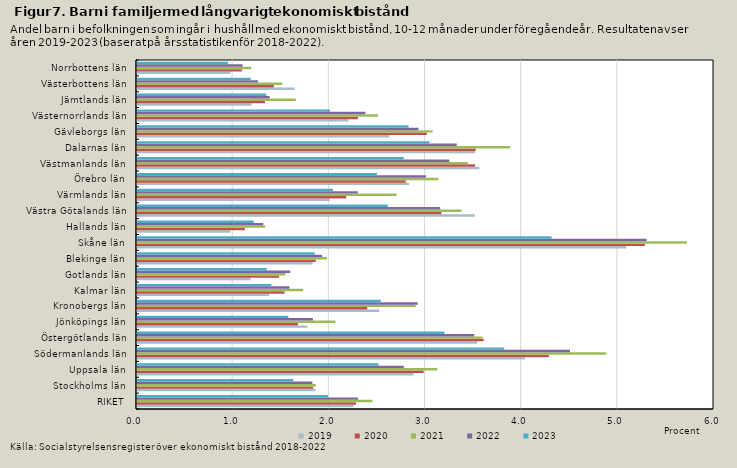
| Category | 2019 | 2020 | 2021 | 2022 | 2023 |
|---|---|---|---|---|---|
| RIKET | 2.251 | 2.277 | 2.449 | 2.298 | 1.986 |
| Stockholms län | 1.855 | 1.831 | 1.859 | 1.823 | 1.625 |
| Uppsala län | 2.876 | 2.981 | 3.123 | 2.774 | 2.512 |
| Södermanlands län | 4.034 | 4.282 | 4.881 | 4.503 | 3.818 |
| Östergötlands län | 3.537 | 3.605 | 3.592 | 3.507 | 3.197 |
| Jönköpings län | 1.773 | 1.672 | 2.063 | 1.83 | 1.573 |
| Kronobergs län | 2.52 | 2.394 | 2.897 | 2.919 | 2.536 |
| Kalmar län | 1.375 | 1.534 | 1.728 | 1.586 | 1.398 |
| Gotlands län | 1.182 | 1.478 | 1.543 | 1.594 | 1.351 |
| Blekinge län | 1.827 | 1.859 | 1.975 | 1.924 | 1.846 |
| Skåne län | 5.088 | 5.281 | 5.718 | 5.299 | 4.312 |
| Hallands län | 0.971 | 1.12 | 1.332 | 1.313 | 1.213 |
| Västra Götalands län | 3.513 | 3.165 | 3.375 | 3.153 | 2.607 |
| Värmlands län | 2.004 | 2.176 | 2.699 | 2.296 | 2.037 |
| Örebro län | 2.829 | 2.794 | 3.134 | 3.004 | 2.495 |
| Västmanlands län | 3.56 | 3.515 | 3.439 | 3.247 | 2.773 |
| Dalarnas län | 3.517 | 3.522 | 3.88 | 3.325 | 3.04 |
| Gävleborgs län | 2.624 | 3.014 | 3.074 | 2.927 | 2.824 |
| Västernorrlands län | 2.199 | 2.297 | 2.506 | 2.375 | 2.007 |
| Jämtlands län | 1.189 | 1.331 | 1.651 | 1.379 | 1.344 |
| Västerbottens län | 1.64 | 1.423 | 1.512 | 1.258 | 1.183 |
| Norrbottens län | 0.972 | 1.092 | 1.188 | 1.098 | 0.946 |